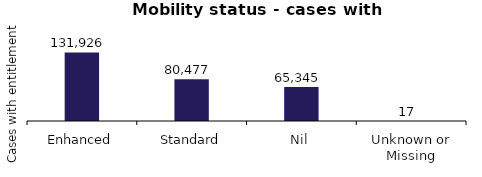
| Category | Number with Entitlement |
|---|---|
| Enhanced | 131926 |
| Standard | 80477 |
| Nil | 65345 |
| Unknown or Missing | 17 |